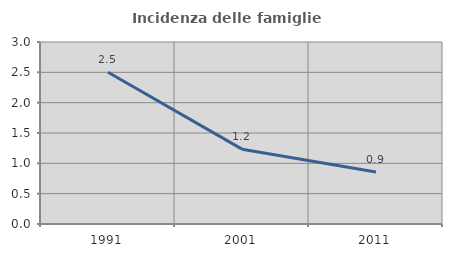
| Category | Incidenza delle famiglie numerose |
|---|---|
| 1991.0 | 2.502 |
| 2001.0 | 1.233 |
| 2011.0 | 0.857 |